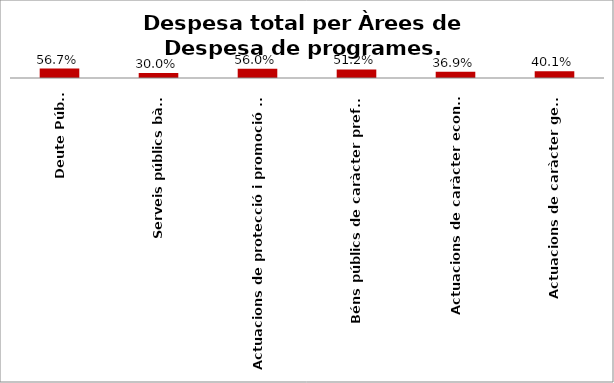
| Category | Series 0 |
|---|---|
| Deute Públic | 0.567 |
| Serveis públics bàsics | 0.3 |
| Actuacions de protecció i promoció social | 0.56 |
| Béns públics de caràcter preferent | 0.512 |
| Actuacions de caràcter econòmic | 0.369 |
| Actuacions de caràcter general | 0.401 |